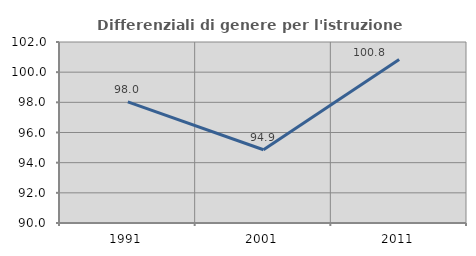
| Category | Differenziali di genere per l'istruzione superiore |
|---|---|
| 1991.0 | 98.027 |
| 2001.0 | 94.858 |
| 2011.0 | 100.841 |